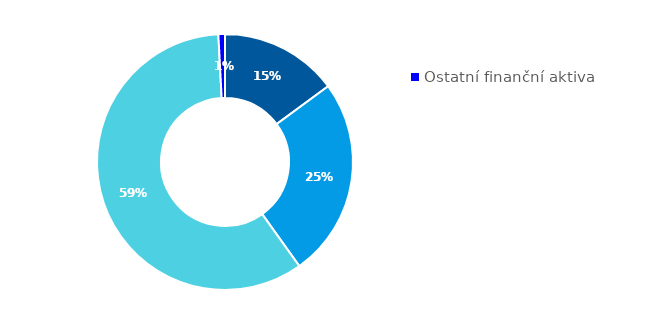
| Category | Series 0 |
|---|---|
| Hotovost | 0.149 |
| Půjčky poskytnuté nemovitostní společnosti | 0.252 |
| Majetkové účasti v nemovitostní společnosti | 0.59 |
| Ostatní finanční aktiva | 0.008 |